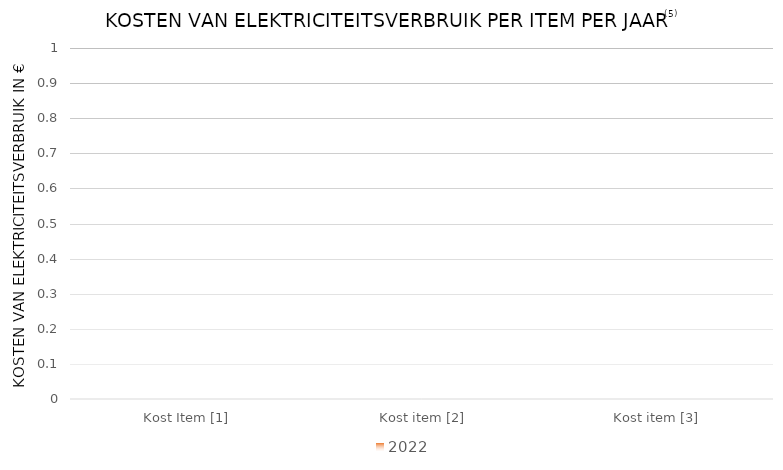
| Category | 2022 |
|---|---|
|  Kost Item [1] | 0 |
|  Kost item [2] | 0 |
|  Kost item [3] | 0 |